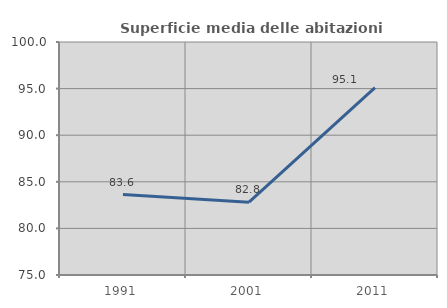
| Category | Superficie media delle abitazioni occupate |
|---|---|
| 1991.0 | 83.627 |
| 2001.0 | 82.818 |
| 2011.0 | 95.094 |